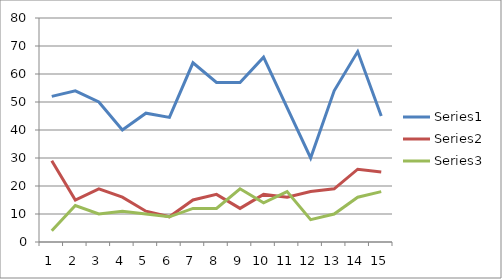
| Category | Series 0 | Series 1 | Series 2 |
|---|---|---|---|
| 0 | 52 | 29 | 4 |
| 1 | 54 | 15 | 13 |
| 2 | 50 | 19 | 10 |
| 3 | 40 | 16 | 11 |
| 4 | 46 | 11 | 10 |
| 5 | 44.5 | 9 | 9 |
| 6 | 64 | 15 | 12 |
| 7 | 57 | 17 | 12 |
| 8 | 57 | 12 | 19 |
| 9 | 66 | 17 | 14 |
| 10 | 48 | 16 | 18 |
| 11 | 30 | 18 | 8 |
| 12 | 54 | 19 | 10 |
| 13 | 68 | 26 | 16 |
| 14 | 45 | 25 | 18 |